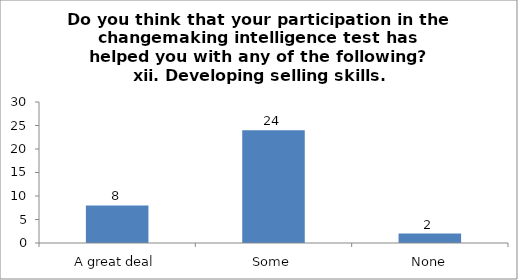
| Category | Do you think that your participation in the changemaking intelligence test has helped you with any of the following?
 xii. Developing selling skills. |
|---|---|
| A great deal | 8 |
| Some | 24 |
| None | 2 |